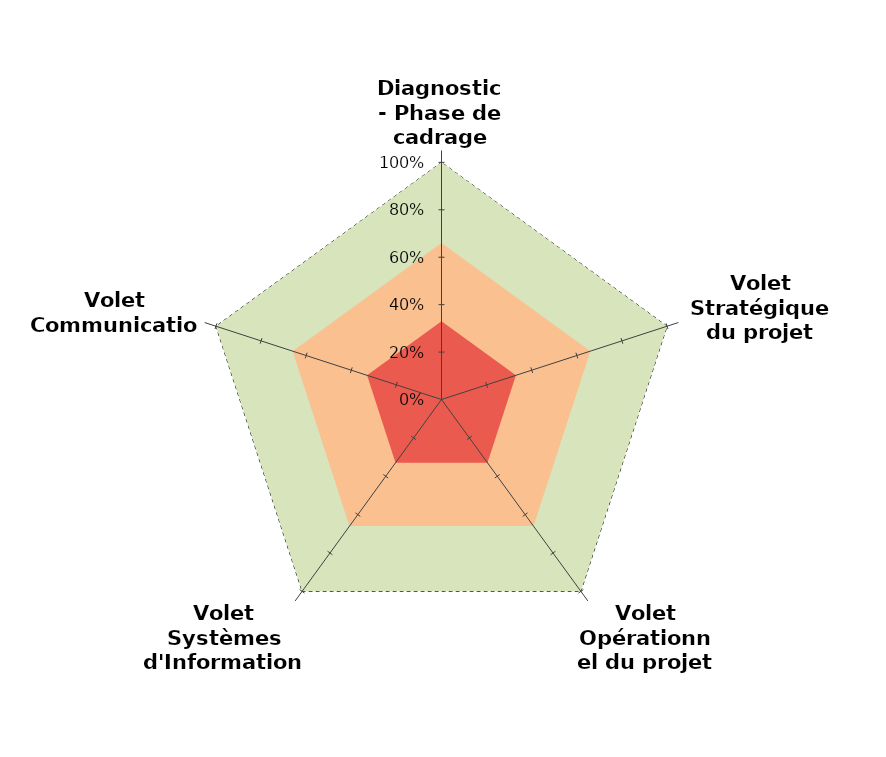
| Category | Elevé | Moyen | Faible | Votre position |
|---|---|---|---|---|
| Diagnostic - Phase de cadrage | 1 | 0.66 | 0.33 | 0 |
| Volet Stratégique du projet | 1 | 0.66 | 0.33 | 0 |
| Volet Opérationnel du projet | 1 | 0.66 | 0.33 | 0 |
| Volet Systèmes d'Information (SI) | 1 | 0.66 | 0.33 | 0 |
| Volet Communication | 1 | 0.66 | 0.33 | 0 |